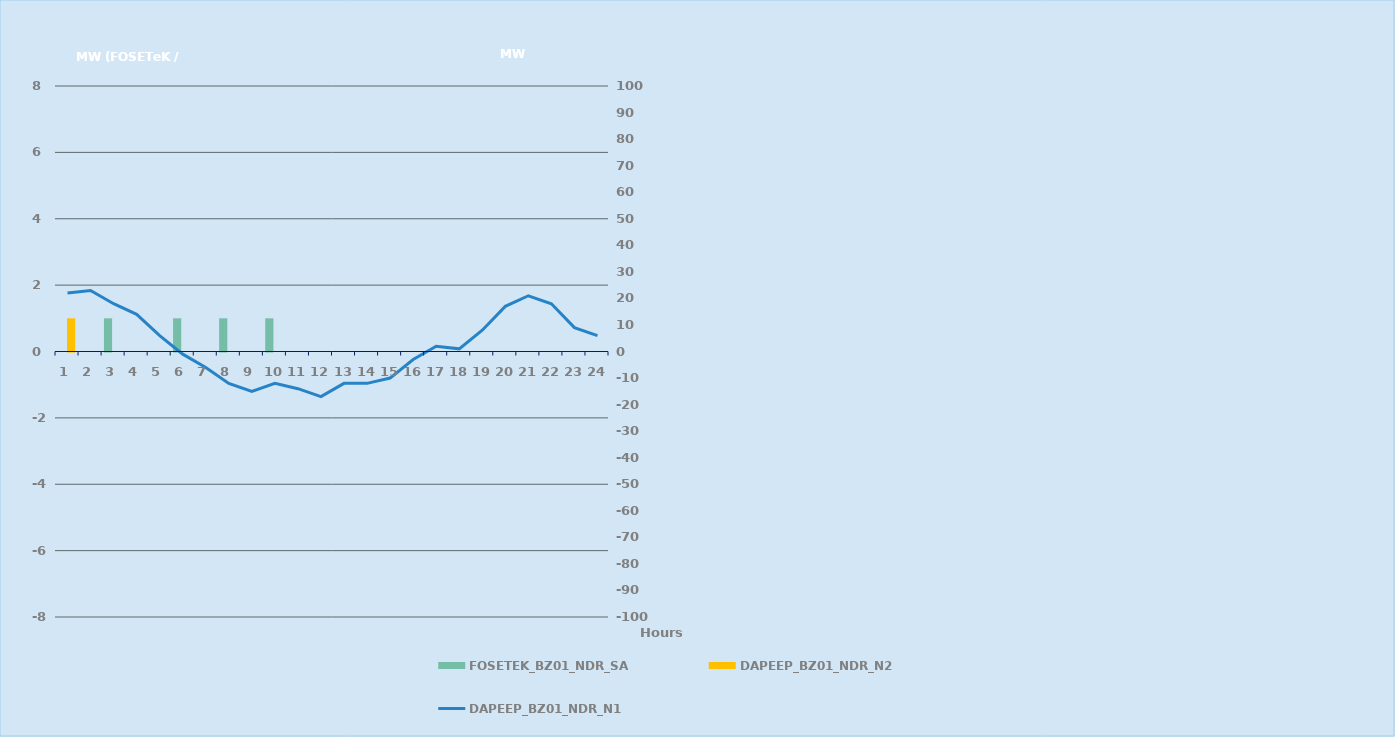
| Category | FOSETEK_BZ01_NDR_SA | DAPEEP_BZ01_NDR_N2 |
|---|---|---|
| 0 | 0 | 1 |
| 1 | 0 | 0 |
| 2 | 1 | 0 |
| 3 | 0 | 0 |
| 4 | 0 | 0 |
| 5 | 1 | 0 |
| 6 | 0 | 0 |
| 7 | 1 | 0 |
| 8 | 0 | 0 |
| 9 | 1 | 0 |
| 10 | 0 | 0 |
| 11 | 0 | 0 |
| 12 | 0 | 0 |
| 13 | 0 | 0 |
| 14 | 0 | 0 |
| 15 | 0 | 0 |
| 16 | 0 | 0 |
| 17 | 0 | 0 |
| 18 | 0 | 0 |
| 19 | 0 | 0 |
| 20 | 0 | 0 |
| 21 | 0 | 0 |
| 22 | 0 | 0 |
| 23 | 0 | 0 |